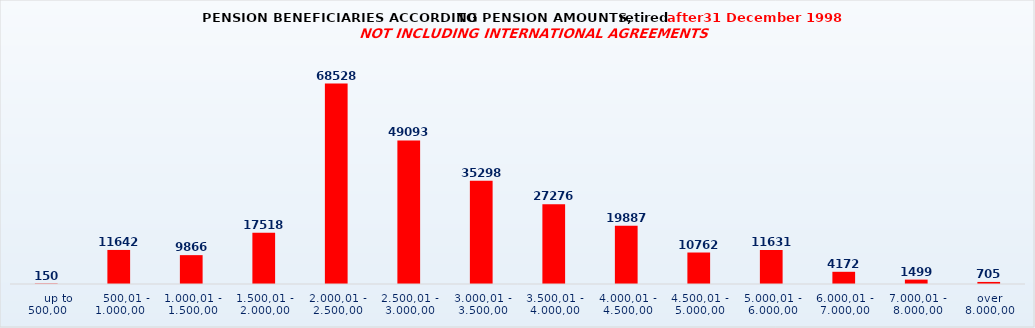
| Category | Series 0 |
|---|---|
|      up to 500,00 | 150 |
|    500,01 - 1.000,00 | 11642 |
| 1.000,01 - 1.500,00 | 9866 |
| 1.500,01 - 2.000,00 | 17518 |
| 2.000,01 - 2.500,00 | 68528 |
| 2.500,01 - 3.000,00 | 49093 |
| 3.000,01 - 3.500,00 | 35298 |
| 3.500,01 - 4.000,00 | 27276 |
| 4.000,01 - 4.500,00 | 19887 |
| 4.500,01 - 5.000,00 | 10762 |
| 5.000,01 - 6.000,00 | 11631 |
| 6.000,01 - 7.000,00 | 4172 |
| 7.000,01 - 8.000,00 | 1499 |
| over 8.000,00 | 705 |